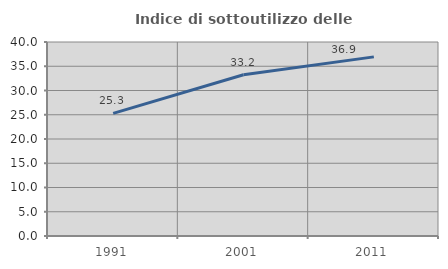
| Category | Indice di sottoutilizzo delle abitazioni  |
|---|---|
| 1991.0 | 25.287 |
| 2001.0 | 33.244 |
| 2011.0 | 36.934 |